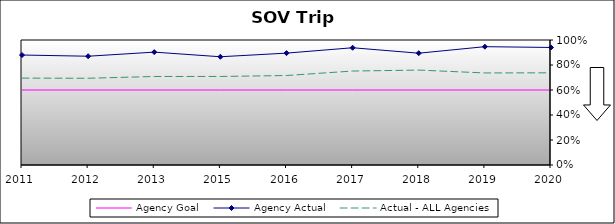
| Category | Agency Goal | Agency Actual | Actual - ALL Agencies |
|---|---|---|---|
| 2011.0 | 0.6 | 0.88 | 0.695 |
| 2012.0 | 0.6 | 0.87 | 0.694 |
| 2013.0 | 0.6 | 0.903 | 0.708 |
| 2015.0 | 0.6 | 0.866 | 0.708 |
| 2016.0 | 0.6 | 0.895 | 0.716 |
| 2017.0 | 0.6 | 0.938 | 0.752 |
| 2018.0 | 0.6 | 0.894 | 0.759 |
| 2019.0 | 0.6 | 0.947 | 0.736 |
| 2020.0 | 0.6 | 0.94 | 0.737 |